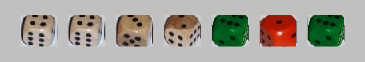
| Category | 1 | 2 | 3 | 4 | 5 | 6 |
|---|---|---|---|---|---|---|
| 4.0 | -1 | 0 | 0 | 1 | 0 | 0 |
| 4.0 | -1 | 0 | 0 | 1 | 0 | 0 |
| 3.0 | -1 | 0 | 1 | 0 | 0 | 0 |
| 2.0 | -1 | 1 | 0 | 0 | 0 | 0 |
| 6.0 | -1 | 0 | 0 | 0 | 0 | 1 |
| 1.0 | 1 | 0 | 0 | 0 | 0 | 0 |
| 6.0 | -1 | 0 | 0 | 0 | 0 | 1 |